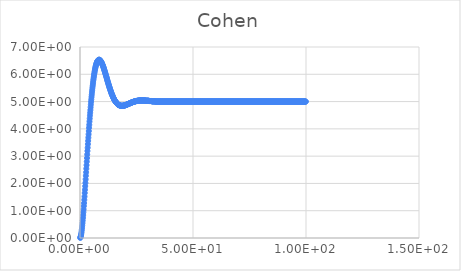
| Category | Series 0 |
|---|---|
| 0.1 | 0.005 |
| 0.2 | 0.021 |
| 0.3 | 0.047 |
| 0.4 | 0.082 |
| 0.5 | 0.126 |
| 0.6 | 0.179 |
| 0.7 | 0.239 |
| 0.8 | 0.306 |
| 0.9 | 0.38 |
| 1.0 | 0.461 |
| 1.1 | 0.547 |
| 1.2 | 0.639 |
| 1.3 | 0.736 |
| 1.4 | 0.838 |
| 1.5 | 0.943 |
| 1.6 | 1.05 |
| 1.7 | 1.17 |
| 1.8 | 1.28 |
| 1.9 | 1.4 |
| 2.0 | 1.52 |
| 2.1 | 1.65 |
| 2.2 | 1.77 |
| 2.3 | 1.9 |
| 2.4 | 2.02 |
| 2.5 | 2.15 |
| 2.6 | 2.28 |
| 2.7 | 2.41 |
| 2.8 | 2.54 |
| 2.9 | 2.67 |
| 3.0 | 2.8 |
| 3.1 | 2.93 |
| 3.2 | 3.06 |
| 3.3 | 3.19 |
| 3.4 | 3.31 |
| 3.5 | 3.44 |
| 3.6 | 3.56 |
| 3.7 | 3.68 |
| 3.8 | 3.8 |
| 3.9 | 3.92 |
| 4.0 | 4.04 |
| 4.1 | 4.15 |
| 4.2 | 4.27 |
| 4.3 | 4.38 |
| 4.4 | 4.49 |
| 4.5 | 4.59 |
| 4.6 | 4.69 |
| 4.7 | 4.79 |
| 4.8 | 4.89 |
| 4.9 | 4.99 |
| 5.0 | 5.08 |
| 5.1 | 5.17 |
| 5.2 | 5.25 |
| 5.3 | 5.34 |
| 5.4 | 5.42 |
| 5.5 | 5.5 |
| 5.6 | 5.57 |
| 5.7 | 5.64 |
| 5.8 | 5.71 |
| 5.9 | 5.78 |
| 6.0 | 5.84 |
| 6.1 | 5.9 |
| 6.2 | 5.96 |
| 6.3 | 6.01 |
| 6.4 | 6.06 |
| 6.5 | 6.11 |
| 6.6 | 6.16 |
| 6.7 | 6.2 |
| 6.8 | 6.24 |
| 6.9 | 6.28 |
| 7.0 | 6.31 |
| 7.1 | 6.34 |
| 7.2 | 6.37 |
| 7.3 | 6.4 |
| 7.4 | 6.42 |
| 7.5 | 6.44 |
| 7.6 | 6.46 |
| 7.7 | 6.48 |
| 7.8 | 6.49 |
| 7.9 | 6.5 |
| 8.0 | 6.51 |
| 8.1 | 6.52 |
| 8.2 | 6.53 |
| 8.3 | 6.53 |
| 8.4 | 6.53 |
| 8.5 | 6.53 |
| 8.6 | 6.53 |
| 8.7 | 6.53 |
| 8.8 | 6.52 |
| 8.9 | 6.51 |
| 9.0 | 6.5 |
| 9.1 | 6.49 |
| 9.2 | 6.48 |
| 9.3 | 6.47 |
| 9.4 | 6.45 |
| 9.5 | 6.44 |
| 9.6 | 6.42 |
| 9.7 | 6.4 |
| 9.8 | 6.38 |
| 9.9 | 6.36 |
| 10.0 | 6.34 |
| 10.1 | 6.32 |
| 10.2 | 6.3 |
| 10.3 | 6.28 |
| 10.4 | 6.25 |
| 10.5 | 6.23 |
| 10.6 | 6.2 |
| 10.7 | 6.17 |
| 10.8 | 6.15 |
| 10.9 | 6.12 |
| 11.0 | 6.09 |
| 11.1 | 6.07 |
| 11.2 | 6.04 |
| 11.3 | 6.01 |
| 11.4 | 5.98 |
| 11.5 | 5.95 |
| 11.6 | 5.93 |
| 11.7 | 5.9 |
| 11.8 | 5.87 |
| 11.9 | 5.84 |
| 12.0 | 5.81 |
| 12.1 | 5.78 |
| 12.2 | 5.75 |
| 12.3 | 5.72 |
| 12.4 | 5.7 |
| 12.5 | 5.67 |
| 12.6 | 5.64 |
| 12.7 | 5.61 |
| 12.8 | 5.59 |
| 12.9 | 5.56 |
| 13.0 | 5.53 |
| 13.1 | 5.51 |
| 13.2 | 5.48 |
| 13.3 | 5.46 |
| 13.4 | 5.43 |
| 13.5 | 5.41 |
| 13.6 | 5.38 |
| 13.7 | 5.36 |
| 13.8 | 5.34 |
| 13.9 | 5.31 |
| 14.0 | 5.29 |
| 14.1 | 5.27 |
| 14.2 | 5.25 |
| 14.3 | 5.23 |
| 14.4 | 5.21 |
| 14.5 | 5.19 |
| 14.6 | 5.17 |
| 14.7 | 5.15 |
| 14.8 | 5.13 |
| 14.9 | 5.12 |
| 15.0 | 5.1 |
| 15.1 | 5.08 |
| 15.2 | 5.07 |
| 15.3 | 5.05 |
| 15.4 | 5.04 |
| 15.5 | 5.03 |
| 15.6 | 5.01 |
| 15.7 | 5 |
| 15.8 | 4.99 |
| 15.9 | 4.98 |
| 16.0 | 4.97 |
| 16.1 | 4.96 |
| 16.2 | 4.95 |
| 16.3 | 4.94 |
| 16.4 | 4.93 |
| 16.5 | 4.92 |
| 16.6 | 4.91 |
| 16.7 | 4.9 |
| 16.8 | 4.9 |
| 16.9 | 4.89 |
| 17.0 | 4.88 |
| 17.1 | 4.88 |
| 17.2 | 4.87 |
| 17.3 | 4.87 |
| 17.4 | 4.87 |
| 17.5 | 4.86 |
| 17.6 | 4.86 |
| 17.7 | 4.86 |
| 17.8 | 4.85 |
| 17.9 | 4.85 |
| 18.0 | 4.85 |
| 18.1 | 4.85 |
| 18.2 | 4.85 |
| 18.3 | 4.84 |
| 18.4 | 4.84 |
| 18.5 | 4.84 |
| 18.6 | 4.84 |
| 18.7 | 4.84 |
| 18.8 | 4.84 |
| 18.9 | 4.85 |
| 19.0 | 4.85 |
| 19.1 | 4.85 |
| 19.2 | 4.85 |
| 19.3 | 4.85 |
| 19.4 | 4.85 |
| 19.5 | 4.85 |
| 19.6 | 4.86 |
| 19.7 | 4.86 |
| 19.8 | 4.86 |
| 19.9 | 4.86 |
| 20.0 | 4.87 |
| 20.1 | 4.87 |
| 20.2 | 4.87 |
| 20.3 | 4.88 |
| 20.4 | 4.88 |
| 20.5 | 4.88 |
| 20.6 | 4.89 |
| 20.7 | 4.89 |
| 20.8 | 4.89 |
| 20.9 | 4.9 |
| 21.0 | 4.9 |
| 21.1 | 4.9 |
| 21.2 | 4.91 |
| 21.3 | 4.91 |
| 21.4 | 4.91 |
| 21.5 | 4.92 |
| 21.6 | 4.92 |
| 21.7 | 4.92 |
| 21.8 | 4.93 |
| 21.9 | 4.93 |
| 22.0 | 4.94 |
| 22.1 | 4.94 |
| 22.2 | 4.94 |
| 22.3 | 4.95 |
| 22.4 | 4.95 |
| 22.5 | 4.95 |
| 22.6 | 4.96 |
| 22.7 | 4.96 |
| 22.8 | 4.96 |
| 22.9 | 4.97 |
| 23.0 | 4.97 |
| 23.1 | 4.97 |
| 23.2 | 4.98 |
| 23.3 | 4.98 |
| 23.4 | 4.98 |
| 23.5 | 4.99 |
| 23.6 | 4.99 |
| 23.7 | 4.99 |
| 23.8 | 4.99 |
| 23.9 | 5 |
| 24.0 | 5 |
| 24.1 | 5 |
| 24.2 | 5 |
| 24.3 | 5.01 |
| 24.4 | 5.01 |
| 24.5 | 5.01 |
| 24.6 | 5.01 |
| 24.7 | 5.02 |
| 24.8 | 5.02 |
| 24.9 | 5.02 |
| 25.0 | 5.02 |
| 25.1 | 5.02 |
| 25.2 | 5.02 |
| 25.3 | 5.03 |
| 25.4 | 5.03 |
| 25.5 | 5.03 |
| 25.6 | 5.03 |
| 25.7 | 5.03 |
| 25.8 | 5.03 |
| 25.9 | 5.03 |
| 26.0 | 5.03 |
| 26.1 | 5.03 |
| 26.2 | 5.04 |
| 26.3 | 5.04 |
| 26.4 | 5.04 |
| 26.5 | 5.04 |
| 26.6 | 5.04 |
| 26.7 | 5.04 |
| 26.8 | 5.04 |
| 26.9 | 5.04 |
| 27.0 | 5.04 |
| 27.1 | 5.04 |
| 27.2 | 5.04 |
| 27.3 | 5.04 |
| 27.4 | 5.04 |
| 27.5 | 5.04 |
| 27.6 | 5.04 |
| 27.7 | 5.04 |
| 27.8 | 5.04 |
| 27.9 | 5.04 |
| 28.0 | 5.04 |
| 28.1 | 5.04 |
| 28.2 | 5.04 |
| 28.3 | 5.04 |
| 28.4 | 5.04 |
| 28.5 | 5.04 |
| 28.6 | 5.04 |
| 28.7 | 5.04 |
| 28.8 | 5.04 |
| 28.9 | 5.04 |
| 29.0 | 5.03 |
| 29.1 | 5.03 |
| 29.2 | 5.03 |
| 29.3 | 5.03 |
| 29.4 | 5.03 |
| 29.5 | 5.03 |
| 29.6 | 5.03 |
| 29.7 | 5.03 |
| 29.8 | 5.03 |
| 29.9 | 5.03 |
| 30.0 | 5.03 |
| 30.1 | 5.03 |
| 30.2 | 5.03 |
| 30.3 | 5.03 |
| 30.4 | 5.03 |
| 30.5 | 5.02 |
| 30.6 | 5.02 |
| 30.7 | 5.02 |
| 30.8 | 5.02 |
| 30.9 | 5.02 |
| 31.0 | 5.02 |
| 31.1 | 5.02 |
| 31.2 | 5.02 |
| 31.3 | 5.02 |
| 31.4 | 5.02 |
| 31.5 | 5.02 |
| 31.6 | 5.02 |
| 31.7 | 5.02 |
| 31.8 | 5.01 |
| 31.9 | 5.01 |
| 32.0 | 5.01 |
| 32.1 | 5.01 |
| 32.2 | 5.01 |
| 32.3 | 5.01 |
| 32.4 | 5.01 |
| 32.5 | 5.01 |
| 32.6 | 5.01 |
| 32.7 | 5.01 |
| 32.8 | 5.01 |
| 32.9 | 5.01 |
| 33.0 | 5.01 |
| 33.1 | 5.01 |
| 33.2 | 5.01 |
| 33.3 | 5.01 |
| 33.4 | 5 |
| 33.5 | 5 |
| 33.6 | 5 |
| 33.7 | 5 |
| 33.8 | 5 |
| 33.9 | 5 |
| 34.0 | 5 |
| 34.1 | 5 |
| 34.2 | 5 |
| 34.3 | 5 |
| 34.4 | 5 |
| 34.5 | 5 |
| 34.6 | 5 |
| 34.7 | 5 |
| 34.8 | 5 |
| 34.9 | 5 |
| 35.0 | 5 |
| 35.1 | 5 |
| 35.2 | 5 |
| 35.3 | 5 |
| 35.4 | 5 |
| 35.5 | 5 |
| 35.6 | 5 |
| 35.7 | 5 |
| 35.8 | 5 |
| 35.9 | 5 |
| 36.0 | 5 |
| 36.1 | 5 |
| 36.2 | 5 |
| 36.3 | 5 |
| 36.4 | 5 |
| 36.5 | 5 |
| 36.6 | 5 |
| 36.7 | 5 |
| 36.8 | 5 |
| 36.9 | 5 |
| 37.0 | 5 |
| 37.1 | 5 |
| 37.2 | 5 |
| 37.3 | 5 |
| 37.4 | 5 |
| 37.5 | 5 |
| 37.6 | 5 |
| 37.7 | 5 |
| 37.8 | 5 |
| 37.9 | 5 |
| 38.0 | 5 |
| 38.1 | 5 |
| 38.2 | 5 |
| 38.3 | 5 |
| 38.4 | 5 |
| 38.5 | 5 |
| 38.6 | 5 |
| 38.7 | 5 |
| 38.8 | 5 |
| 38.9 | 5 |
| 39.0 | 5 |
| 39.1 | 5 |
| 39.2 | 5 |
| 39.3 | 5 |
| 39.4 | 5 |
| 39.5 | 5 |
| 39.6 | 5 |
| 39.7 | 5 |
| 39.8 | 5 |
| 39.9 | 5 |
| 40.0 | 5 |
| 40.1 | 5 |
| 40.2 | 5 |
| 40.3 | 5 |
| 40.4 | 5 |
| 40.5 | 5 |
| 40.6 | 5 |
| 40.7 | 5 |
| 40.8 | 5 |
| 40.9 | 5 |
| 41.0 | 5 |
| 41.1 | 5 |
| 41.2 | 5 |
| 41.3 | 5 |
| 41.4 | 5 |
| 41.5 | 5 |
| 41.6 | 5 |
| 41.7 | 5 |
| 41.8 | 5 |
| 41.9 | 5 |
| 42.0 | 5 |
| 42.1 | 5 |
| 42.2 | 5 |
| 42.3 | 5 |
| 42.4 | 5 |
| 42.5 | 5 |
| 42.6 | 5 |
| 42.7 | 5 |
| 42.8 | 5 |
| 42.9 | 5 |
| 43.0 | 5 |
| 43.1 | 5 |
| 43.2 | 5 |
| 43.3 | 5 |
| 43.4 | 5 |
| 43.5 | 5 |
| 43.6 | 5 |
| 43.7 | 5 |
| 43.8 | 5 |
| 43.9 | 5 |
| 44.0 | 5 |
| 44.1 | 5 |
| 44.2 | 5 |
| 44.3 | 5 |
| 44.4 | 5 |
| 44.5 | 5 |
| 44.6 | 5 |
| 44.7 | 5 |
| 44.8 | 5 |
| 44.9 | 5 |
| 45.0 | 5 |
| 45.1 | 5 |
| 45.2 | 5 |
| 45.3 | 5 |
| 45.4 | 5 |
| 45.5 | 5 |
| 45.6 | 5 |
| 45.7 | 5 |
| 45.8 | 5 |
| 45.9 | 5 |
| 46.0 | 5 |
| 46.1 | 5 |
| 46.2 | 5 |
| 46.3 | 5 |
| 46.4 | 5 |
| 46.5 | 5 |
| 46.6 | 5 |
| 46.7 | 5 |
| 46.8 | 5 |
| 46.9 | 5 |
| 47.0 | 5 |
| 47.1 | 5 |
| 47.2 | 5 |
| 47.3 | 5 |
| 47.4 | 5 |
| 47.5 | 5 |
| 47.6 | 5 |
| 47.7 | 5 |
| 47.8 | 5 |
| 47.9 | 5 |
| 48.0 | 5 |
| 48.1 | 5 |
| 48.2 | 5 |
| 48.3 | 5 |
| 48.4 | 5 |
| 48.5 | 5 |
| 48.6 | 5 |
| 48.7 | 5 |
| 48.8 | 5 |
| 48.9 | 5 |
| 49.0 | 5 |
| 49.1 | 5 |
| 49.2 | 5 |
| 49.3 | 5 |
| 49.4 | 5 |
| 49.5 | 5 |
| 49.6 | 5 |
| 49.7 | 5 |
| 49.8 | 5 |
| 49.9 | 5 |
| 50.0 | 5 |
| 50.1 | 5 |
| 50.2 | 5 |
| 50.3 | 5 |
| 50.4 | 5 |
| 50.5 | 5 |
| 50.6 | 5 |
| 50.7 | 5 |
| 50.8 | 5 |
| 50.9 | 5 |
| 51.0 | 5 |
| 51.1 | 5 |
| 51.2 | 5 |
| 51.3 | 5 |
| 51.4 | 5 |
| 51.5 | 5 |
| 51.6 | 5 |
| 51.7 | 5 |
| 51.8 | 5 |
| 51.9 | 5 |
| 52.0 | 5 |
| 52.1 | 5 |
| 52.2 | 5 |
| 52.3 | 5 |
| 52.4 | 5 |
| 52.5 | 5 |
| 52.6 | 5 |
| 52.7 | 5 |
| 52.8 | 5 |
| 52.9 | 5 |
| 53.0 | 5 |
| 53.1 | 5 |
| 53.2 | 5 |
| 53.3 | 5 |
| 53.4 | 5 |
| 53.5 | 5 |
| 53.6 | 5 |
| 53.7 | 5 |
| 53.8 | 5 |
| 53.9 | 5 |
| 54.0 | 5 |
| 54.1 | 5 |
| 54.2 | 5 |
| 54.3 | 5 |
| 54.4 | 5 |
| 54.5 | 5 |
| 54.6 | 5 |
| 54.7 | 5 |
| 54.8 | 5 |
| 54.9 | 5 |
| 55.0 | 5 |
| 55.1 | 5 |
| 55.2 | 5 |
| 55.3 | 5 |
| 55.4 | 5 |
| 55.5 | 5 |
| 55.6 | 5 |
| 55.7 | 5 |
| 55.8 | 5 |
| 55.9 | 5 |
| 56.0 | 5 |
| 56.1 | 5 |
| 56.2 | 5 |
| 56.3 | 5 |
| 56.4 | 5 |
| 56.5 | 5 |
| 56.6 | 5 |
| 56.7 | 5 |
| 56.8 | 5 |
| 56.9 | 5 |
| 57.0 | 5 |
| 57.1 | 5 |
| 57.2 | 5 |
| 57.3 | 5 |
| 57.4 | 5 |
| 57.5 | 5 |
| 57.6 | 5 |
| 57.7 | 5 |
| 57.8 | 5 |
| 57.9 | 5 |
| 58.0 | 5 |
| 58.1 | 5 |
| 58.2 | 5 |
| 58.3 | 5 |
| 58.4 | 5 |
| 58.5 | 5 |
| 58.6 | 5 |
| 58.7 | 5 |
| 58.8 | 5 |
| 58.9 | 5 |
| 59.0 | 5 |
| 59.1 | 5 |
| 59.2 | 5 |
| 59.3 | 5 |
| 59.4 | 5 |
| 59.5 | 5 |
| 59.6 | 5 |
| 59.7 | 5 |
| 59.8 | 5 |
| 59.9 | 5 |
| 60.0 | 5 |
| 60.1 | 5 |
| 60.2 | 5 |
| 60.3 | 5 |
| 60.4 | 5 |
| 60.5 | 5 |
| 60.6 | 5 |
| 60.7 | 5 |
| 60.8 | 5 |
| 60.9 | 5 |
| 61.0 | 5 |
| 61.1 | 5 |
| 61.2 | 5 |
| 61.3 | 5 |
| 61.4 | 5 |
| 61.5 | 5 |
| 61.6 | 5 |
| 61.7 | 5 |
| 61.8 | 5 |
| 61.9 | 5 |
| 62.0 | 5 |
| 62.1 | 5 |
| 62.2 | 5 |
| 62.3 | 5 |
| 62.4 | 5 |
| 62.5 | 5 |
| 62.6 | 5 |
| 62.7 | 5 |
| 62.8 | 5 |
| 62.9 | 5 |
| 63.0 | 5 |
| 63.1 | 5 |
| 63.2 | 5 |
| 63.3 | 5 |
| 63.4 | 5 |
| 63.5 | 5 |
| 63.6 | 5 |
| 63.7 | 5 |
| 63.8 | 5 |
| 63.9 | 5 |
| 64.0 | 5 |
| 64.1 | 5 |
| 64.2 | 5 |
| 64.3 | 5 |
| 64.4 | 5 |
| 64.5 | 5 |
| 64.6 | 5 |
| 64.7 | 5 |
| 64.8 | 5 |
| 64.9 | 5 |
| 65.0 | 5 |
| 65.1 | 5 |
| 65.2 | 5 |
| 65.3 | 5 |
| 65.4 | 5 |
| 65.5 | 5 |
| 65.6 | 5 |
| 65.7 | 5 |
| 65.8 | 5 |
| 65.9 | 5 |
| 66.0 | 5 |
| 66.1 | 5 |
| 66.2 | 5 |
| 66.3 | 5 |
| 66.4 | 5 |
| 66.5 | 5 |
| 66.6 | 5 |
| 66.7 | 5 |
| 66.8 | 5 |
| 66.9 | 5 |
| 67.0 | 5 |
| 67.1 | 5 |
| 67.2 | 5 |
| 67.3 | 5 |
| 67.4 | 5 |
| 67.5 | 5 |
| 67.6 | 5 |
| 67.7 | 5 |
| 67.8 | 5 |
| 67.9 | 5 |
| 68.0 | 5 |
| 68.1 | 5 |
| 68.2 | 5 |
| 68.3 | 5 |
| 68.4 | 5 |
| 68.5 | 5 |
| 68.6 | 5 |
| 68.7 | 5 |
| 68.8 | 5 |
| 68.9 | 5 |
| 69.0 | 5 |
| 69.1 | 5 |
| 69.2 | 5 |
| 69.3 | 5 |
| 69.4 | 5 |
| 69.5 | 5 |
| 69.6 | 5 |
| 69.7 | 5 |
| 69.8 | 5 |
| 69.9 | 5 |
| 70.0 | 5 |
| 70.1 | 5 |
| 70.2 | 5 |
| 70.3 | 5 |
| 70.4 | 5 |
| 70.5 | 5 |
| 70.6 | 5 |
| 70.7 | 5 |
| 70.8 | 5 |
| 70.9 | 5 |
| 71.0 | 5 |
| 71.1 | 5 |
| 71.2 | 5 |
| 71.3 | 5 |
| 71.4 | 5 |
| 71.5 | 5 |
| 71.6 | 5 |
| 71.7 | 5 |
| 71.8 | 5 |
| 71.9 | 5 |
| 72.0 | 5 |
| 72.1 | 5 |
| 72.2 | 5 |
| 72.3 | 5 |
| 72.4 | 5 |
| 72.5 | 5 |
| 72.6 | 5 |
| 72.7 | 5 |
| 72.8 | 5 |
| 72.9 | 5 |
| 73.0 | 5 |
| 73.1 | 5 |
| 73.2 | 5 |
| 73.3 | 5 |
| 73.4 | 5 |
| 73.5 | 5 |
| 73.6 | 5 |
| 73.7 | 5 |
| 73.8 | 5 |
| 73.9 | 5 |
| 74.0 | 5 |
| 74.1 | 5 |
| 74.2 | 5 |
| 74.3 | 5 |
| 74.4 | 5 |
| 74.5 | 5 |
| 74.6 | 5 |
| 74.7 | 5 |
| 74.8 | 5 |
| 74.9 | 5 |
| 75.0 | 5 |
| 75.1 | 5 |
| 75.2 | 5 |
| 75.3 | 5 |
| 75.4 | 5 |
| 75.5 | 5 |
| 75.6 | 5 |
| 75.7 | 5 |
| 75.8 | 5 |
| 75.9 | 5 |
| 76.0 | 5 |
| 76.1 | 5 |
| 76.2 | 5 |
| 76.3 | 5 |
| 76.4 | 5 |
| 76.5 | 5 |
| 76.6 | 5 |
| 76.7 | 5 |
| 76.8 | 5 |
| 76.9 | 5 |
| 77.0 | 5 |
| 77.1 | 5 |
| 77.2 | 5 |
| 77.3 | 5 |
| 77.4 | 5 |
| 77.5 | 5 |
| 77.6 | 5 |
| 77.7 | 5 |
| 77.8 | 5 |
| 77.9 | 5 |
| 78.0 | 5 |
| 78.1 | 5 |
| 78.2 | 5 |
| 78.3 | 5 |
| 78.4 | 5 |
| 78.5 | 5 |
| 78.6 | 5 |
| 78.7 | 5 |
| 78.8 | 5 |
| 78.9 | 5 |
| 79.0 | 5 |
| 79.1 | 5 |
| 79.2 | 5 |
| 79.3 | 5 |
| 79.4 | 5 |
| 79.5 | 5 |
| 79.6 | 5 |
| 79.7 | 5 |
| 79.8 | 5 |
| 79.9 | 5 |
| 80.0 | 5 |
| 80.1 | 5 |
| 80.2 | 5 |
| 80.3 | 5 |
| 80.4 | 5 |
| 80.5 | 5 |
| 80.6 | 5 |
| 80.7 | 5 |
| 80.8 | 5 |
| 80.9 | 5 |
| 81.0 | 5 |
| 81.1 | 5 |
| 81.2 | 5 |
| 81.3 | 5 |
| 81.4 | 5 |
| 81.5 | 5 |
| 81.6 | 5 |
| 81.7 | 5 |
| 81.8 | 5 |
| 81.9 | 5 |
| 82.0 | 5 |
| 82.1 | 5 |
| 82.2 | 5 |
| 82.3 | 5 |
| 82.4 | 5 |
| 82.5 | 5 |
| 82.6 | 5 |
| 82.7 | 5 |
| 82.8 | 5 |
| 82.9 | 5 |
| 83.0 | 5 |
| 83.1 | 5 |
| 83.2 | 5 |
| 83.3 | 5 |
| 83.4 | 5 |
| 83.5 | 5 |
| 83.6 | 5 |
| 83.7 | 5 |
| 83.8 | 5 |
| 83.9 | 5 |
| 84.0 | 5 |
| 84.1 | 5 |
| 84.2 | 5 |
| 84.3 | 5 |
| 84.4 | 5 |
| 84.5 | 5 |
| 84.6 | 5 |
| 84.7 | 5 |
| 84.8 | 5 |
| 84.9 | 5 |
| 85.0 | 5 |
| 85.1 | 5 |
| 85.2 | 5 |
| 85.3 | 5 |
| 85.4 | 5 |
| 85.5 | 5 |
| 85.6 | 5 |
| 85.7 | 5 |
| 85.8 | 5 |
| 85.9 | 5 |
| 86.0 | 5 |
| 86.1 | 5 |
| 86.2 | 5 |
| 86.3 | 5 |
| 86.4 | 5 |
| 86.5 | 5 |
| 86.6 | 5 |
| 86.7 | 5 |
| 86.8 | 5 |
| 86.9 | 5 |
| 87.0 | 5 |
| 87.1 | 5 |
| 87.2 | 5 |
| 87.3 | 5 |
| 87.4 | 5 |
| 87.5 | 5 |
| 87.6 | 5 |
| 87.7 | 5 |
| 87.8 | 5 |
| 87.9 | 5 |
| 88.0 | 5 |
| 88.1 | 5 |
| 88.2 | 5 |
| 88.3 | 5 |
| 88.4 | 5 |
| 88.5 | 5 |
| 88.6 | 5 |
| 88.7 | 5 |
| 88.8 | 5 |
| 88.9 | 5 |
| 89.0 | 5 |
| 89.1 | 5 |
| 89.2 | 5 |
| 89.3 | 5 |
| 89.4 | 5 |
| 89.5 | 5 |
| 89.6 | 5 |
| 89.7 | 5 |
| 89.8 | 5 |
| 89.9 | 5 |
| 90.0 | 5 |
| 90.1 | 5 |
| 90.2 | 5 |
| 90.3 | 5 |
| 90.4 | 5 |
| 90.5 | 5 |
| 90.6 | 5 |
| 90.7 | 5 |
| 90.8 | 5 |
| 90.9 | 5 |
| 91.0 | 5 |
| 91.1 | 5 |
| 91.2 | 5 |
| 91.3 | 5 |
| 91.4 | 5 |
| 91.5 | 5 |
| 91.6 | 5 |
| 91.7 | 5 |
| 91.8 | 5 |
| 91.9 | 5 |
| 92.0 | 5 |
| 92.1 | 5 |
| 92.2 | 5 |
| 92.3 | 5 |
| 92.4 | 5 |
| 92.5 | 5 |
| 92.6 | 5 |
| 92.7 | 5 |
| 92.8 | 5 |
| 92.9 | 5 |
| 93.0 | 5 |
| 93.1 | 5 |
| 93.2 | 5 |
| 93.3 | 5 |
| 93.4 | 5 |
| 93.5 | 5 |
| 93.6 | 5 |
| 93.7 | 5 |
| 93.8 | 5 |
| 93.9 | 5 |
| 94.0 | 5 |
| 94.1 | 5 |
| 94.2 | 5 |
| 94.3 | 5 |
| 94.4 | 5 |
| 94.5 | 5 |
| 94.6 | 5 |
| 94.7 | 5 |
| 94.8 | 5 |
| 94.9 | 5 |
| 95.0 | 5 |
| 95.1 | 5 |
| 95.2 | 5 |
| 95.3 | 5 |
| 95.4 | 5 |
| 95.5 | 5 |
| 95.6 | 5 |
| 95.7 | 5 |
| 95.8 | 5 |
| 95.9 | 5 |
| 96.0 | 5 |
| 96.1 | 5 |
| 96.2 | 5 |
| 96.3 | 5 |
| 96.4 | 5 |
| 96.5 | 5 |
| 96.6 | 5 |
| 96.7 | 5 |
| 96.8 | 5 |
| 96.9 | 5 |
| 97.0 | 5 |
| 97.1 | 5 |
| 97.2 | 5 |
| 97.3 | 5 |
| 97.4 | 5 |
| 97.5 | 5 |
| 97.6 | 5 |
| 97.7 | 5 |
| 97.8 | 5 |
| 97.9 | 5 |
| 98.0 | 5 |
| 98.1 | 5 |
| 98.2 | 5 |
| 98.3 | 5 |
| 98.4 | 5 |
| 98.5 | 5 |
| 98.6 | 5 |
| 98.7 | 5 |
| 98.8 | 5 |
| 98.9 | 5 |
| 99.0 | 5 |
| 99.1 | 5 |
| 99.2 | 5 |
| 99.3 | 5 |
| 99.4 | 5 |
| 99.5 | 5 |
| 99.6 | 5 |
| 99.7 | 5 |
| 99.8 | 5 |
| 99.9 | 5 |